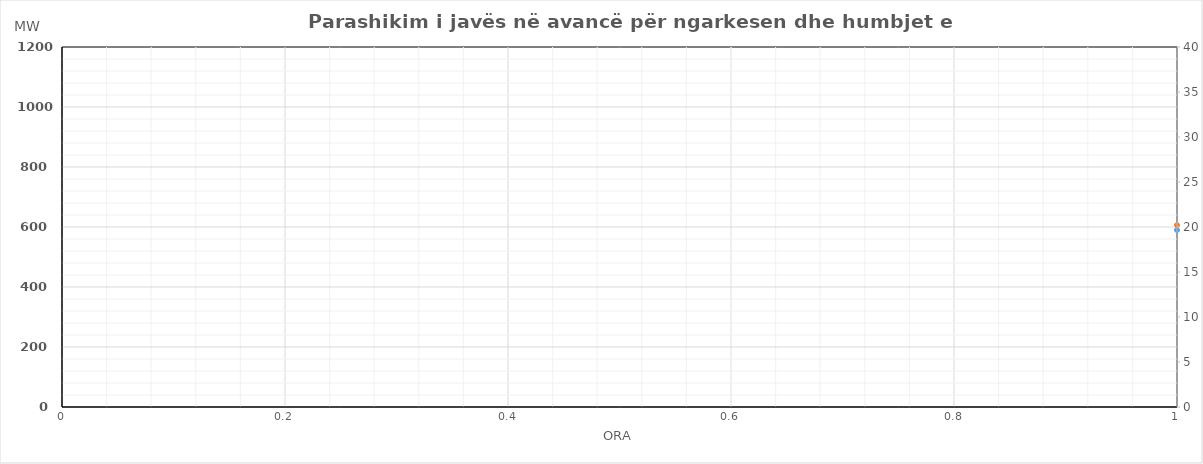
| Category | Ngarkesa (MWh) |
|---|---|
| 0 | 606.47 |
| 1 | 557.25 |
| 2 | 536.53 |
| 3 | 524.34 |
| 4 | 528.01 |
| 5 | 560.4 |
| 6 | 643.47 |
| 7 | 774.35 |
| 8 | 857.74 |
| 9 | 884.87 |
| 10 | 891.95 |
| 11 | 907.6 |
| 12 | 899.78 |
| 13 | 903.02 |
| 14 | 835.81 |
| 15 | 837.34 |
| 16 | 839.03 |
| 17 | 883.6 |
| 18 | 929.68 |
| 19 | 978.88 |
| 20 | 985 |
| 21 | 903.7 |
| 22 | 809.7 |
| 23 | 703.63 |
| 24 | 639.75 |
| 25 | 585.54 |
| 26 | 555.94 |
| 27 | 538.43 |
| 28 | 538.94 |
| 29 | 570.19 |
| 30 | 641.75 |
| 31 | 754 |
| 32 | 837.77 |
| 33 | 849.16 |
| 34 | 855.15 |
| 35 | 870.86 |
| 36 | 871.26 |
| 37 | 877.48 |
| 38 | 857.97 |
| 39 | 846.61 |
| 40 | 849.8 |
| 41 | 876.12 |
| 42 | 906.6 |
| 43 | 946.32 |
| 44 | 949.91 |
| 45 | 867.35 |
| 46 | 783.85 |
| 47 | 680.91 |
| 48 | 599.7 |
| 49 | 558.19 |
| 50 | 533.79 |
| 51 | 522.18 |
| 52 | 524.79 |
| 53 | 561.54 |
| 54 | 645.9 |
| 55 | 771.15 |
| 56 | 852.47 |
| 57 | 874.86 |
| 58 | 886.15 |
| 59 | 899.06 |
| 60 | 906.76 |
| 61 | 911.48 |
| 62 | 896.37 |
| 63 | 886.61 |
| 64 | 890.6 |
| 65 | 912.42 |
| 66 | 934.3 |
| 67 | 979.92 |
| 68 | 974.81 |
| 69 | 891.75 |
| 70 | 799.75 |
| 71 | 693.71 |
| 72 | 606.4 |
| 73 | 560.29 |
| 74 | 537.39 |
| 75 | 530.78 |
| 76 | 533.29 |
| 77 | 571.24 |
| 78 | 652.3 |
| 79 | 797.75 |
| 80 | 881.57 |
| 81 | 913.56 |
| 82 | 915.15 |
| 83 | 913.96 |
| 84 | 907.56 |
| 85 | 917.48 |
| 86 | 901.07 |
| 87 | 884.61 |
| 88 | 890.9 |
| 89 | 916.42 |
| 90 | 954.2 |
| 91 | 1006.22 |
| 92 | 1000.01 |
| 93 | 913.05 |
| 94 | 814.45 |
| 95 | 710.31 |
| 96 | 637.19 |
| 97 | 589.28 |
| 98 | 565.76 |
| 99 | 556.38 |
| 100 | 559.84 |
| 101 | 597.07 |
| 102 | 684.3 |
| 103 | 822.4 |
| 104 | 896.63 |
| 105 | 908.97 |
| 106 | 901.05 |
| 107 | 905.75 |
| 108 | 900.78 |
| 109 | 906.56 |
| 110 | 892.46 |
| 111 | 879.87 |
| 112 | 886.89 |
| 113 | 925.39 |
| 114 | 968.51 |
| 115 | 1024.52 |
| 116 | 1016.99 |
| 117 | 921.37 |
| 118 | 822.84 |
| 119 | 714.97 |
| 120 | 606.4 |
| 121 | 560.29 |
| 122 | 537.39 |
| 123 | 530.78 |
| 124 | 533.29 |
| 125 | 571.24 |
| 126 | 652.3 |
| 127 | 797.75 |
| 128 | 881.57 |
| 129 | 913.56 |
| 130 | 915.15 |
| 131 | 913.96 |
| 132 | 907.56 |
| 133 | 917.48 |
| 134 | 901.07 |
| 135 | 884.61 |
| 136 | 890.9 |
| 137 | 916.42 |
| 138 | 954.2 |
| 139 | 1006.22 |
| 140 | 1000.01 |
| 141 | 913.05 |
| 142 | 814.45 |
| 143 | 710.31 |
| 144 | 637.19 |
| 145 | 589.28 |
| 146 | 565.76 |
| 147 | 556.38 |
| 148 | 559.84 |
| 149 | 597.07 |
| 150 | 684.3 |
| 151 | 822.4 |
| 152 | 896.63 |
| 153 | 908.97 |
| 154 | 901.05 |
| 155 | 905.75 |
| 156 | 900.78 |
| 157 | 906.56 |
| 158 | 892.46 |
| 159 | 879.87 |
| 160 | 886.89 |
| 161 | 925.39 |
| 162 | 968.51 |
| 163 | 1024.52 |
| 164 | 1016.99 |
| 165 | 921.37 |
| 166 | 822.84 |
| 167 | 714.97 |